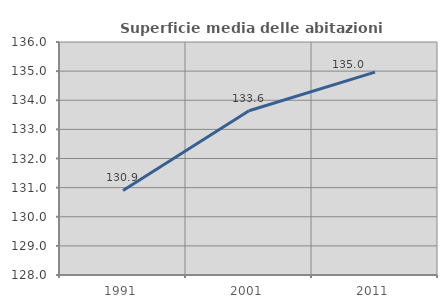
| Category | Superficie media delle abitazioni occupate |
|---|---|
| 1991.0 | 130.901 |
| 2001.0 | 133.641 |
| 2011.0 | 134.968 |